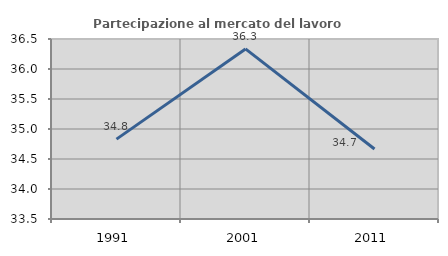
| Category | Partecipazione al mercato del lavoro  femminile |
|---|---|
| 1991.0 | 34.831 |
| 2001.0 | 36.334 |
| 2011.0 | 34.667 |